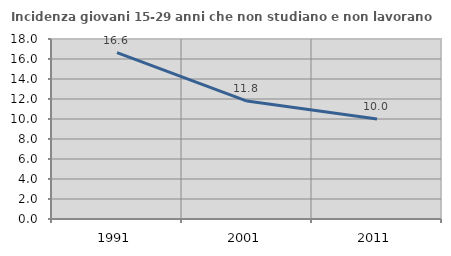
| Category | Incidenza giovani 15-29 anni che non studiano e non lavorano  |
|---|---|
| 1991.0 | 16.636 |
| 2001.0 | 11.792 |
| 2011.0 | 10 |